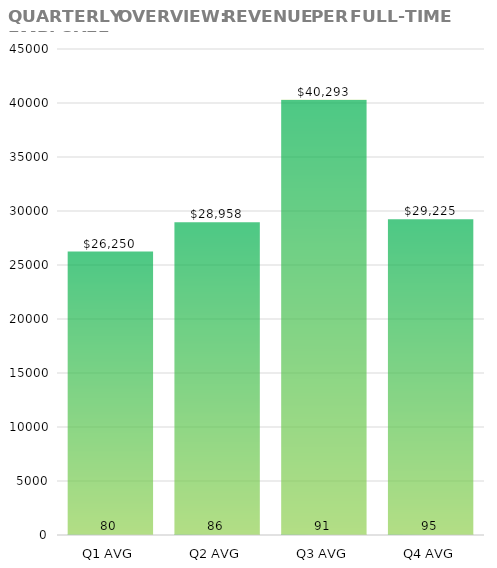
| Category | FULL-TIME EMPLOYEES | REVENUE PER EMPLOYEE |
|---|---|---|
| Q1 AVG | 80 | 26250 |
| Q2 AVG | 86.333 | 28957.529 |
| Q3 AVG | 91 | 40293.04 |
| Q4 AVG | 94.667 | 29225.352 |